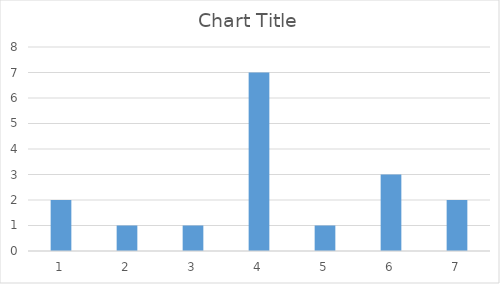
| Category | Series 0 |
|---|---|
| 0 | 2 |
| 1 | 1 |
| 2 | 1 |
| 3 | 7 |
| 4 | 1 |
| 5 | 3 |
| 6 | 2 |